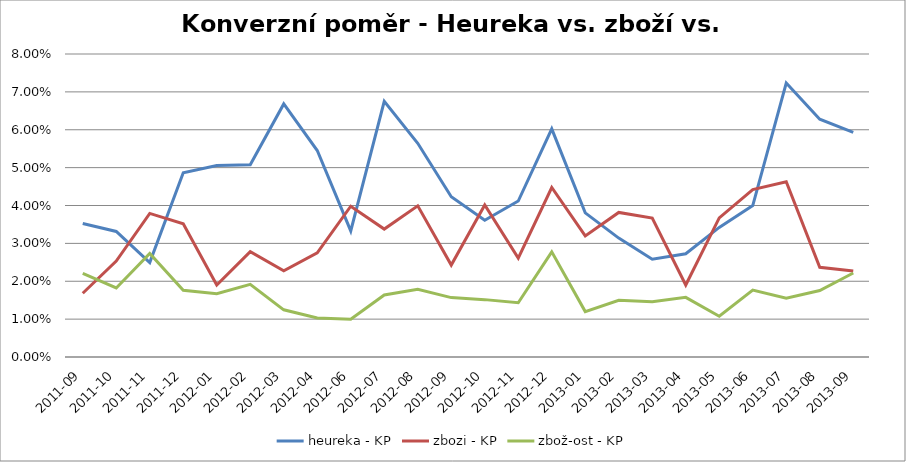
| Category | heureka - KP | zbozi - KP | zbož-ost - KP |
|---|---|---|---|
| 2011-09 | 0.035 | 0.017 | 0.022 |
| 2011-10 | 0.033 | 0.025 | 0.018 |
| 2011-11 | 0.025 | 0.038 | 0.027 |
| 2011-12 | 0.049 | 0.035 | 0.018 |
| 2012-01 | 0.051 | 0.019 | 0.017 |
| 2012-02 | 0.051 | 0.028 | 0.019 |
| 2012-03 | 0.067 | 0.023 | 0.012 |
| 2012-04 | 0.055 | 0.027 | 0.01 |
| 2012-06 | 0.033 | 0.04 | 0.01 |
| 2012-07 | 0.068 | 0.034 | 0.016 |
| 2012-08 | 0.056 | 0.04 | 0.018 |
| 2012-09 | 0.042 | 0.024 | 0.016 |
| 2012-10 | 0.036 | 0.04 | 0.015 |
| 2012-11 | 0.041 | 0.026 | 0.014 |
| 2012-12 | 0.06 | 0.045 | 0.028 |
| 2013-01 | 0.038 | 0.032 | 0.012 |
| 2013-02 | 0.031 | 0.038 | 0.015 |
| 2013-03 | 0.026 | 0.037 | 0.015 |
| 2013-04 | 0.027 | 0.019 | 0.016 |
| 2013-05 | 0.034 | 0.037 | 0.011 |
| 2013-06 | 0.04 | 0.044 | 0.018 |
| 2013-07 | 0.072 | 0.046 | 0.016 |
| 2013-08 | 0.063 | 0.024 | 0.018 |
| 2013-09 | 0.059 | 0.023 | 0.022 |